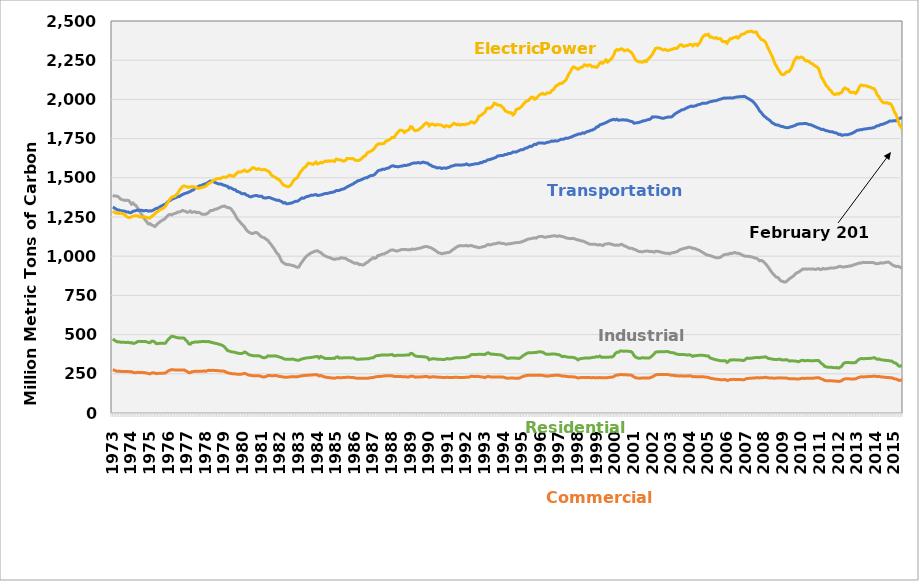
| Category | Commercial Sector | Residential Sector | Industrial Sector | Transportation Sector | Electric Power Sector |
|---|---|---|---|---|---|
| 1973 | 275.438 | 471.942 | 1388.537 | 1312.881 | 1286.353 |
| 1974 January | 273.147 | 465.008 | 1383.552 | 1308.249 | 1280.262 |
| 1974 February | 267.897 | 457.848 | 1383.984 | 1301.215 | 1275.005 |
| 1974 March | 266.469 | 453.42 | 1381.849 | 1295.399 | 1273.75 |
| 1974 April | 267.102 | 454.028 | 1375.39 | 1294.64 | 1272.86 |
| 1974 May | 265.525 | 451.425 | 1364.812 | 1290.01 | 1276.205 |
| 1974 June | 264.767 | 451.348 | 1359.73 | 1289.068 | 1270.364 |
| 1974 July | 264.638 | 451.832 | 1358.257 | 1288.843 | 1269.63 |
| 1974 August | 264.029 | 450.334 | 1355.682 | 1285.774 | 1261.769 |
| 1974 September | 264.437 | 450.129 | 1356.745 | 1282.4 | 1252.474 |
| 1974 October | 265.311 | 451.55 | 1355.984 | 1282.005 | 1247.282 |
| 1974 November | 262.946 | 447.094 | 1346.487 | 1276.76 | 1246.289 |
| 1974 | 264.147 | 449.229 | 1331.92 | 1279.01 | 1250.643 |
| 1975 January | 259.053 | 443.889 | 1339.331 | 1286.574 | 1255.421 |
| 1975 February | 257.606 | 444.877 | 1328.371 | 1288.177 | 1258.224 |
| 1975 March | 257.066 | 448.704 | 1323.031 | 1291.118 | 1258.217 |
| 1975 April | 259.427 | 455.693 | 1307.342 | 1294.078 | 1257.758 |
| 1975 May | 258.969 | 456.906 | 1289.276 | 1293.314 | 1251.508 |
| 1975 June | 258.351 | 456.369 | 1275.248 | 1293.404 | 1252.335 |
| 1975 July | 257.861 | 456.158 | 1261.04 | 1292.045 | 1247.775 |
| 1975 August | 257.286 | 456.347 | 1244.287 | 1288.835 | 1251.193 |
| 1975 September | 256.63 | 455.958 | 1229.707 | 1291.48 | 1250.619 |
| 1975 October | 254.264 | 453.274 | 1217.451 | 1291.472 | 1246.881 |
| 1975 November | 251.112 | 449.152 | 1205.385 | 1286.928 | 1242.758 |
| 1975 | 249.468 | 448.516 | 1207.828 | 1289.447 | 1243.814 |
| 1976 January | 254.906 | 457.341 | 1198.398 | 1288.711 | 1253.431 |
| 1976 February | 256.434 | 458.3 | 1195.954 | 1293.071 | 1259.773 |
| 1976 March | 255.288 | 453.085 | 1189.014 | 1299.261 | 1268.966 |
| 1976 April | 250.744 | 442.574 | 1196.568 | 1304.642 | 1277.929 |
| 1976 May | 251.843 | 442.326 | 1208.164 | 1306.317 | 1284.897 |
| 1976 June | 253.241 | 444.453 | 1215.377 | 1312.325 | 1292.572 |
| 1976 July | 253.649 | 444.836 | 1223.601 | 1318.847 | 1299.356 |
| 1976 August | 254.228 | 444.596 | 1230.134 | 1322.649 | 1302.556 |
| 1976 September | 254.152 | 443.894 | 1234.24 | 1329.107 | 1309.974 |
| 1976 October | 255.251 | 445.522 | 1243.712 | 1331.486 | 1318.639 |
| 1976 November | 263.234 | 459.757 | 1254.378 | 1342.756 | 1336.437 |
| 1976 | 269.318 | 470.952 | 1263.739 | 1351.602 | 1351.186 |
| 1977 January | 273.749 | 481.084 | 1266.524 | 1355.11 | 1366.608 |
| 1977 February | 276.772 | 489.423 | 1262.778 | 1363.095 | 1375.38 |
| 1977 March | 275.544 | 487.574 | 1269.607 | 1366.931 | 1380.036 |
| 1977 April | 274.726 | 485.04 | 1272.575 | 1371.129 | 1381.949 |
| 1977 May | 273.716 | 481.888 | 1275.453 | 1374.932 | 1392.805 |
| 1977 June | 273.55 | 479.632 | 1282.059 | 1379.703 | 1403.152 |
| 1977 July | 274.098 | 478.679 | 1281.819 | 1381.037 | 1420.709 |
| 1977 August | 274.598 | 478.805 | 1285.695 | 1388.669 | 1432.689 |
| 1977 September | 274.752 | 478.242 | 1292.213 | 1393.406 | 1444.917 |
| 1977 October | 274.77 | 477.329 | 1288.221 | 1398.35 | 1448.486 |
| 1977 November | 269.059 | 466.284 | 1285.616 | 1401.854 | 1444.218 |
| 1977 | 264.549 | 456.918 | 1279.253 | 1404.132 | 1442.127 |
| 1978 January | 257.187 | 441.209 | 1282.311 | 1409.092 | 1438.43 |
| 1978 February | 257.437 | 439.174 | 1288.123 | 1412.47 | 1442.626 |
| 1978 March | 263.43 | 448.253 | 1279.67 | 1420.113 | 1443.105 |
| 1978 April | 264.049 | 449.751 | 1282.002 | 1422.431 | 1442.973 |
| 1978 May | 265.604 | 453.099 | 1283.746 | 1434.46 | 1439.545 |
| 1978 June | 265.617 | 453.169 | 1277.821 | 1439.17 | 1438.658 |
| 1978 July | 265.403 | 453.129 | 1279.79 | 1443.256 | 1431.717 |
| 1978 August | 265.938 | 454.423 | 1277.631 | 1449.43 | 1433.98 |
| 1978 September | 266.417 | 455.44 | 1269.993 | 1450.153 | 1436.952 |
| 1978 October | 267.004 | 455.565 | 1266.878 | 1454.96 | 1440.056 |
| 1978 November | 267.626 | 457.013 | 1267.336 | 1460.302 | 1442.871 |
| 1978 | 266.335 | 454.525 | 1267.116 | 1461.427 | 1447.658 |
| 1979 January | 270.022 | 455.808 | 1273.285 | 1467.569 | 1456.078 |
| 1979 February | 272.484 | 456.528 | 1280.157 | 1474.108 | 1464.199 |
| 1979 March | 270.815 | 450.644 | 1291.61 | 1479.407 | 1468.883 |
| 1979 April | 272.569 | 450.56 | 1290.744 | 1477.949 | 1476.218 |
| 1979 May | 271.8 | 446.733 | 1293.645 | 1474.679 | 1483.558 |
| 1979 June | 271.194 | 444.487 | 1300.039 | 1470.058 | 1488.017 |
| 1979 July | 270.686 | 442.769 | 1300.493 | 1465.637 | 1493.681 |
| 1979 August | 269.505 | 440 | 1305.848 | 1461.712 | 1495.486 |
| 1979 September | 268.498 | 436.796 | 1310.218 | 1460.074 | 1493.33 |
| 1979 October | 267.648 | 433.497 | 1315.809 | 1460.265 | 1498.54 |
| 1979 November | 267.892 | 429.814 | 1317.57 | 1454.723 | 1503.732 |
| 1979 | 266.324 | 421.743 | 1320.323 | 1451.995 | 1505.247 |
| 1980 January | 261.117 | 409.968 | 1313.277 | 1448.264 | 1502.008 |
| 1980 February | 255.85 | 398.369 | 1310.914 | 1445.278 | 1507.827 |
| 1980 March | 254.232 | 395.375 | 1309.046 | 1434.705 | 1516.755 |
| 1980 April | 252.231 | 391.707 | 1304.195 | 1436.774 | 1515.627 |
| 1980 May | 250.846 | 389.418 | 1291.967 | 1430.958 | 1510.623 |
| 1980 June | 250.341 | 388.346 | 1278.03 | 1424.941 | 1509.306 |
| 1980 July | 249.341 | 386.177 | 1261.771 | 1423.883 | 1520.232 |
| 1980 August | 247.565 | 382.779 | 1240.816 | 1413.623 | 1529.541 |
| 1980 September | 246.931 | 380.853 | 1230.324 | 1411.082 | 1537.682 |
| 1980 October | 247.092 | 379.778 | 1218.633 | 1406.947 | 1536.481 |
| 1980 November | 247.646 | 379.546 | 1206.796 | 1399.694 | 1538.333 |
| 1980 | 250.12 | 382.493 | 1197.275 | 1397.68 | 1543.709 |
| 1981 January | 253.095 | 389.155 | 1186.117 | 1399.41 | 1549.22 |
| 1981 February | 249.351 | 384.81 | 1169.079 | 1391.008 | 1540.916 |
| 1981 March | 244.531 | 377.161 | 1159.522 | 1387.398 | 1540.148 |
| 1981 April | 241.115 | 371.248 | 1151.529 | 1381.129 | 1546.061 |
| 1981 May | 239.678 | 368.718 | 1147.674 | 1378.307 | 1552.685 |
| 1981 June | 238.244 | 366.349 | 1144.224 | 1382.417 | 1563.416 |
| 1981 July | 237.643 | 365.392 | 1147.177 | 1384.311 | 1563.969 |
| 1981 August | 238.285 | 365.288 | 1151.604 | 1386.815 | 1557.009 |
| 1981 September | 237.63 | 364.171 | 1149.241 | 1386.743 | 1553.345 |
| 1981 October | 237.725 | 364.935 | 1141.887 | 1382.027 | 1558.022 |
| 1981 November | 235.677 | 362.151 | 1131.225 | 1383.01 | 1554.62 |
| 1981 | 232.155 | 356.546 | 1122.786 | 1383.07 | 1551.136 |
| 1982 January | 229.965 | 353.04 | 1119.243 | 1372.983 | 1552.23 |
| 1982 February | 230.525 | 352.919 | 1116.079 | 1371.607 | 1552.55 |
| 1982 March | 233.3 | 355.975 | 1106.634 | 1370.892 | 1547.571 |
| 1982 April | 238.47 | 364.281 | 1101.674 | 1374.882 | 1542.268 |
| 1982 May | 238.663 | 363.974 | 1086.831 | 1374.239 | 1537.037 |
| 1982 June | 238.203 | 363.711 | 1076.183 | 1370.723 | 1520.581 |
| 1982 July | 238.044 | 363.313 | 1061.243 | 1366.341 | 1510.902 |
| 1982 August | 237.796 | 362.822 | 1048.43 | 1363.154 | 1507.262 |
| 1982 September | 239.253 | 364.851 | 1031.702 | 1359.5 | 1501.722 |
| 1982 October | 236.835 | 361.43 | 1017.211 | 1355.982 | 1492.785 |
| 1982 November | 234.672 | 358.449 | 1008.016 | 1357.811 | 1489.66 |
| 1982 | 232.52 | 354.875 | 985.26 | 1351.722 | 1480.79 |
| 1983 January | 231.47 | 352.633 | 965.51 | 1347.666 | 1465.412 |
| 1983 February | 229.205 | 346.258 | 959.009 | 1339.158 | 1454.466 |
| 1983 March | 228.62 | 344.191 | 951.113 | 1342.234 | 1449.722 |
| 1983 April | 228.401 | 342.101 | 947.254 | 1334.331 | 1446.549 |
| 1983 May | 228.918 | 342.956 | 947.54 | 1334.658 | 1443.505 |
| 1983 June | 229.887 | 343.193 | 944.821 | 1337.225 | 1447.079 |
| 1983 July | 231.072 | 343.341 | 943.538 | 1337.673 | 1455.816 |
| 1983 August | 232.155 | 343.904 | 939.494 | 1342.616 | 1475.247 |
| 1983 September | 231.335 | 341.348 | 938.482 | 1346.664 | 1487.73 |
| 1983 October | 231.11 | 338.419 | 932.591 | 1350.24 | 1494.911 |
| 1983 November | 231.534 | 336.21 | 929.033 | 1350.116 | 1500.57 |
| 1983 | 232.769 | 336.025 | 931.137 | 1356.746 | 1520.703 |
| 1984 January | 236.066 | 341.703 | 949.536 | 1364.485 | 1537.076 |
| 1984 February | 237.088 | 344.027 | 963.056 | 1371.671 | 1548.356 |
| 1984 March | 239.016 | 347.594 | 976.866 | 1369.298 | 1561.508 |
| 1984 April | 239.387 | 349.115 | 989.86 | 1375.039 | 1567.983 |
| 1984 May | 240.94 | 351.359 | 1000.998 | 1380.343 | 1577.522 |
| 1984 June | 241.117 | 352.122 | 1008.265 | 1381.731 | 1593.457 |
| 1984 July | 241.596 | 353.157 | 1015.228 | 1385.608 | 1591.697 |
| 1984 August | 242.233 | 354.37 | 1021.601 | 1389.521 | 1589.134 |
| 1984 September | 243.35 | 356.135 | 1025.399 | 1388.115 | 1585.225 |
| 1984 October | 243.762 | 357.54 | 1031.037 | 1391.205 | 1592.512 |
| 1984 November | 244.295 | 359.612 | 1032.392 | 1393.408 | 1600.169 |
| 1984 | 243.246 | 360.11 | 1035.164 | 1387.019 | 1588.294 |
| 1985 January | 236.463 | 351.01 | 1027.815 | 1388.642 | 1591.987 |
| 1985 February | 239.391 | 360.558 | 1023.837 | 1390.377 | 1598.038 |
| 1985 March | 235.77 | 356.956 | 1014.797 | 1392.649 | 1594.99 |
| 1985 April | 231.868 | 352.388 | 1007.012 | 1396.931 | 1600.556 |
| 1985 May | 228.557 | 347.701 | 1000.902 | 1399.559 | 1607.22 |
| 1985 June | 227.235 | 347.068 | 996.989 | 1399.232 | 1603.953 |
| 1985 July | 226.282 | 347.122 | 992.999 | 1402.085 | 1608.504 |
| 1985 August | 224.807 | 347.102 | 990.549 | 1405.396 | 1604.965 |
| 1985 September | 223.327 | 347.003 | 985.712 | 1405.812 | 1608.736 |
| 1985 October | 223.164 | 348.8 | 982.729 | 1409.325 | 1607.199 |
| 1985 November | 221.787 | 348.138 | 979.09 | 1411.008 | 1604.037 |
| 1985 | 224.407 | 355.659 | 982.674 | 1418.344 | 1619.145 |
| 1986 January | 226.812 | 358.28 | 983.324 | 1419.184 | 1617.259 |
| 1986 February | 224.369 | 350.245 | 984.247 | 1419.635 | 1614.461 |
| 1986 March | 225.601 | 351.874 | 989.748 | 1424.337 | 1613.546 |
| 1986 April | 225.605 | 350.484 | 988.389 | 1427.089 | 1609.079 |
| 1986 May | 226.842 | 352.529 | 987.385 | 1429.626 | 1605.871 |
| 1986 June | 227.209 | 352.103 | 986.768 | 1434.932 | 1610.952 |
| 1986 July | 227.305 | 352.098 | 979.775 | 1442.135 | 1623.691 |
| 1986 August | 227.49 | 352.055 | 973.702 | 1446.362 | 1621.745 |
| 1986 September | 227.193 | 351.764 | 970.744 | 1451.566 | 1622.894 |
| 1986 October | 227.015 | 351.364 | 964.127 | 1456.986 | 1621.76 |
| 1986 November | 227.114 | 352.677 | 960.032 | 1460.725 | 1622.516 |
| 1986 | 223.952 | 347.117 | 954.294 | 1469.053 | 1613.249 |
| 1987 January | 221.845 | 343.599 | 955.978 | 1473.401 | 1611.209 |
| 1987 February | 220.826 | 342.453 | 954.565 | 1481.03 | 1609.764 |
| 1987 March | 220.885 | 342.297 | 946.031 | 1482.789 | 1612.685 |
| 1987 April | 221.778 | 344.8 | 946.941 | 1486.873 | 1618.951 |
| 1987 May | 221.343 | 344.053 | 943.626 | 1490.883 | 1627.977 |
| 1987 June | 221.467 | 344.727 | 945.841 | 1496.115 | 1637.871 |
| 1987 July | 222.06 | 345.644 | 955.045 | 1500.296 | 1641.503 |
| 1987 August | 221.621 | 345.401 | 960.587 | 1500.246 | 1658.537 |
| 1987 September | 222.677 | 346.422 | 967.251 | 1507.943 | 1662.847 |
| 1987 October | 224.624 | 349.903 | 976.41 | 1512.636 | 1667.777 |
| 1987 November | 226.012 | 351.763 | 982.426 | 1514.989 | 1672.574 |
| 1987 | 226.832 | 352.778 | 990.275 | 1515.878 | 1680.19 |
| 1988 January | 229.4 | 360.143 | 986.148 | 1522.539 | 1691.889 |
| 1988 February | 231.663 | 365.309 | 990.99 | 1533.461 | 1707.409 |
| 1988 March | 232.577 | 367.157 | 1004.979 | 1544.402 | 1714.642 |
| 1988 April | 232.718 | 366.985 | 1005.196 | 1548.756 | 1718.088 |
| 1988 May | 233.923 | 369.25 | 1010.871 | 1549.821 | 1716.072 |
| 1988 June | 234.891 | 369.313 | 1013.306 | 1555.065 | 1717.634 |
| 1988 July | 235.953 | 369.463 | 1014.341 | 1553.546 | 1719.836 |
| 1988 August | 238.076 | 370.522 | 1020.62 | 1558.015 | 1732.831 |
| 1988 September | 238.045 | 370.488 | 1024.699 | 1561.147 | 1735.963 |
| 1988 October | 237.459 | 369.97 | 1031.049 | 1563.41 | 1741.645 |
| 1988 November | 237.906 | 371.783 | 1037.745 | 1570.704 | 1747.476 |
| 1988 | 237.994 | 373.704 | 1039.294 | 1575.782 | 1757.52 |
| 1989 January | 234.067 | 367.041 | 1039 | 1576.401 | 1755.902 |
| 1989 February | 232.062 | 364.949 | 1035.422 | 1571.705 | 1766.058 |
| 1989 March | 232.745 | 367.439 | 1032.3 | 1572.166 | 1781.227 |
| 1989 April | 232.888 | 368.371 | 1035.234 | 1569.659 | 1793.132 |
| 1989 May | 232.497 | 368.03 | 1037.837 | 1572.632 | 1802.882 |
| 1989 June | 232.563 | 368.886 | 1042.197 | 1574.618 | 1803.668 |
| 1989 July | 231.529 | 368.357 | 1043.624 | 1575.62 | 1801.289 |
| 1989 August | 230.93 | 368.792 | 1042.854 | 1579.92 | 1789.28 |
| 1989 September | 230.711 | 369.551 | 1042.966 | 1577.959 | 1797.151 |
| 1989 October | 229.717 | 369.185 | 1041.119 | 1581.548 | 1802.007 |
| 1989 November | 229.8 | 370.003 | 1041.314 | 1583.052 | 1807.352 |
| 1989 | 234.824 | 380.365 | 1041.426 | 1587.942 | 1825.562 |
| 1990 January | 235.092 | 379.175 | 1045.509 | 1591.172 | 1823.9 |
| 1990 February | 232.158 | 371.647 | 1044.705 | 1594.684 | 1807.279 |
| 1990 March | 228.752 | 363.409 | 1044.005 | 1594.207 | 1800.182 |
| 1990 April | 228.868 | 361.642 | 1047.302 | 1594.894 | 1802.469 |
| 1990 May | 229.033 | 360.503 | 1049.596 | 1597.804 | 1805.166 |
| 1990 June | 229.549 | 359.865 | 1050.636 | 1593.974 | 1813.742 |
| 1990 July | 230.9 | 359.586 | 1053.6 | 1595.762 | 1820.872 |
| 1990 August | 231.491 | 359.063 | 1058.018 | 1600.1 | 1830.63 |
| 1990 September | 232.254 | 357.983 | 1059.939 | 1597.698 | 1841.336 |
| 1990 October | 232.678 | 356.111 | 1061.95 | 1594.605 | 1850.448 |
| 1990 November | 232.168 | 352.758 | 1060.585 | 1593.569 | 1847.906 |
| 1990 | 226.818 | 339.703 | 1056.671 | 1584.446 | 1831.001 |
| 1991 January | 229.638 | 344.298 | 1054.563 | 1580.782 | 1841.275 |
| 1991 February | 230.533 | 345.248 | 1049.042 | 1574.119 | 1842.962 |
| 1991 March | 230.881 | 346.451 | 1042.926 | 1570.255 | 1839.533 |
| 1991 April | 229.805 | 344.649 | 1036.637 | 1568.326 | 1834.278 |
| 1991 May | 229.212 | 343.403 | 1028.857 | 1563.106 | 1840.275 |
| 1991 June | 228.432 | 342.593 | 1021.567 | 1563.528 | 1837.578 |
| 1991 July | 228.246 | 342.671 | 1019.891 | 1564.379 | 1837.519 |
| 1991 August | 227.149 | 341.637 | 1015.621 | 1558.998 | 1835.298 |
| 1991 September | 226.138 | 340.938 | 1017.84 | 1561.864 | 1828.739 |
| 1991 October | 226.207 | 341.031 | 1019.333 | 1563.175 | 1824.026 |
| 1991 November | 227.18 | 345.452 | 1022.305 | 1560.748 | 1832.321 |
| 1991 | 227.773 | 347.278 | 1023.211 | 1564.794 | 1829.556 |
| 1992 January | 225.63 | 343.915 | 1025.105 | 1566.9 | 1825.051 |
| 1992 February | 225.866 | 346.351 | 1031.505 | 1573.981 | 1830.649 |
| 1992 March | 225.777 | 346.93 | 1040.228 | 1574.906 | 1839.915 |
| 1992 April | 227.248 | 350.547 | 1046.169 | 1578.577 | 1847.667 |
| 1992 May | 227.631 | 351.592 | 1053.955 | 1582.214 | 1842.27 |
| 1992 June | 227.544 | 352.352 | 1060.212 | 1580.843 | 1837.877 |
| 1992 July | 226.688 | 352.388 | 1064.994 | 1582.006 | 1841.91 |
| 1992 August | 226.402 | 351.98 | 1067.635 | 1580.685 | 1835.924 |
| 1992 September | 227.084 | 353.272 | 1065.895 | 1581.235 | 1840.04 |
| 1992 October | 226.818 | 354.296 | 1065.88 | 1582.672 | 1840.53 |
| 1992 November | 226.863 | 353.28 | 1065.98 | 1583.506 | 1838.132 |
| 1992 | 228.833 | 357.098 | 1069.17 | 1588.494 | 1843.422 |
| 1993 January | 228.162 | 358.825 | 1064.642 | 1583.674 | 1843.138 |
| 1993 February | 230.1 | 363.281 | 1067.03 | 1580.614 | 1849.074 |
| 1993 March | 233.624 | 371.685 | 1068.128 | 1583.518 | 1857.106 |
| 1993 April | 233.831 | 373.164 | 1065.752 | 1585.33 | 1854.181 |
| 1993 May | 232.802 | 372.66 | 1061.119 | 1587.425 | 1848.738 |
| 1993 June | 232.836 | 373.146 | 1060.499 | 1589.503 | 1856.828 |
| 1993 July | 232.569 | 373.578 | 1056.773 | 1589.957 | 1869.845 |
| 1993 August | 232.395 | 374.918 | 1054.034 | 1591.243 | 1892.943 |
| 1993 September | 231.085 | 374.49 | 1056.492 | 1596.84 | 1895.929 |
| 1993 October | 229.719 | 373.631 | 1058.634 | 1596.585 | 1902.704 |
| 1993 November | 228.516 | 373.976 | 1061.7 | 1603.253 | 1911.036 |
| 1993 | 226.052 | 372.423 | 1063.125 | 1603.957 | 1919.085 |
| 1994 January | 230.696 | 380.346 | 1070.58 | 1609.692 | 1940.389 |
| 1994 February | 233.095 | 384.534 | 1075.452 | 1614.794 | 1945.454 |
| 1994 March | 231.355 | 379.363 | 1071.388 | 1616.146 | 1942.798 |
| 1994 April | 229.501 | 375.137 | 1073.649 | 1619.902 | 1948.148 |
| 1994 May | 229.993 | 375.582 | 1077.334 | 1622.2 | 1959.283 |
| 1994 June | 230.066 | 374.428 | 1079.897 | 1626.997 | 1975.976 |
| 1994 July | 230.071 | 373.204 | 1080.02 | 1629.679 | 1972.012 |
| 1994 August | 230.065 | 372.439 | 1083.689 | 1638.695 | 1964.486 |
| 1994 September | 229.862 | 371.401 | 1085.235 | 1639.525 | 1963.085 |
| 1994 October | 230.204 | 370.906 | 1083.767 | 1642.484 | 1961.709 |
| 1994 November | 229.424 | 367.544 | 1080.412 | 1641.552 | 1953.184 |
| 1994 | 228.598 | 364.235 | 1080.607 | 1644.094 | 1943.845 |
| 1995 January | 224.386 | 355.231 | 1077.821 | 1648.647 | 1926.892 |
| 1995 February | 222.507 | 350.347 | 1075.403 | 1648.756 | 1922.719 |
| 1995 March | 221.486 | 348.083 | 1078.956 | 1654.712 | 1917.747 |
| 1995 April | 222.617 | 350.106 | 1078.892 | 1654.358 | 1914.008 |
| 1995 May | 223.255 | 350.698 | 1081.331 | 1657.695 | 1914.236 |
| 1995 June | 222.771 | 350.872 | 1082.725 | 1664.338 | 1900.732 |
| 1995 July | 221.996 | 350.468 | 1085.102 | 1664.71 | 1908.879 |
| 1995 August | 221.812 | 349.191 | 1085.414 | 1664.03 | 1933.873 |
| 1995 September | 222.297 | 348.825 | 1087.651 | 1669.453 | 1939.88 |
| 1995 October | 222.352 | 347.871 | 1086.833 | 1673.273 | 1941.444 |
| 1995 November | 226.155 | 353.671 | 1090.334 | 1678.79 | 1949.505 |
| 1995 | 231.353 | 360.945 | 1092.335 | 1678.088 | 1960.035 |
| 1996 January | 235.02 | 368.837 | 1097.231 | 1681.789 | 1972.529 |
| 1996 February | 236.982 | 374.044 | 1101.095 | 1689.096 | 1982.575 |
| 1996 March | 239.809 | 380.798 | 1105.713 | 1689.805 | 1990.289 |
| 1996 April | 241.325 | 383.784 | 1109.965 | 1695.625 | 1993.075 |
| 1996 May | 241.308 | 384.475 | 1110.567 | 1701.308 | 2003.56 |
| 1996 June | 241.31 | 384.815 | 1113.073 | 1699.54 | 2013.937 |
| 1996 July | 241.462 | 384.899 | 1115.003 | 1707.699 | 2013.382 |
| 1996 August | 241.194 | 385.44 | 1117.073 | 1714.151 | 2000.747 |
| 1996 September | 240.695 | 386.086 | 1114.802 | 1712.169 | 2006.308 |
| 1996 October | 241.344 | 388.592 | 1122.707 | 1720.501 | 2016.505 |
| 1996 November | 241.565 | 390.717 | 1124.981 | 1721.835 | 2028.171 |
| 1996 | 240.029 | 389.36 | 1125.174 | 1721.988 | 2033.237 |
| 1997 January | 239.972 | 388.342 | 1126.06 | 1722.371 | 2039.14 |
| 1997 February | 237.855 | 382.936 | 1122.43 | 1720.217 | 2033.131 |
| 1997 March | 235.86 | 376.657 | 1120.383 | 1721.409 | 2033.658 |
| 1997 April | 235.07 | 374.569 | 1123.553 | 1725.923 | 2041.404 |
| 1997 May | 236.138 | 375.099 | 1125.186 | 1727.294 | 2040.897 |
| 1997 June | 237.333 | 375.219 | 1125.142 | 1730.122 | 2042.221 |
| 1997 July | 238.711 | 375.812 | 1128.287 | 1735.013 | 2056.773 |
| 1997 August | 239.751 | 376.105 | 1129.594 | 1732.49 | 2061.293 |
| 1997 September | 240.741 | 375.755 | 1130.055 | 1736.493 | 2075.255 |
| 1997 October | 241.114 | 374.501 | 1127.657 | 1734.013 | 2088.442 |
| 1997 November | 240.413 | 372.067 | 1127.489 | 1735.775 | 2090.352 |
| 1997 | 240.199 | 371.064 | 1130.451 | 1740.947 | 2101.384 |
| 1998 January | 237.25 | 363.834 | 1126.504 | 1745.484 | 2100.409 |
| 1998 February | 235.06 | 359.169 | 1124.668 | 1745.414 | 2104.308 |
| 1998 March | 235.418 | 361.701 | 1122.482 | 1747.484 | 2115.08 |
| 1998 April | 234.115 | 359.447 | 1117.902 | 1752.931 | 2120.987 |
| 1998 May | 232.549 | 356.559 | 1114.956 | 1751.528 | 2140.1 |
| 1998 June | 231.583 | 355.829 | 1113.406 | 1754.336 | 2162.647 |
| 1998 July | 231.043 | 355.558 | 1111.866 | 1757.833 | 2175.163 |
| 1998 August | 230.972 | 355.082 | 1113.303 | 1761.962 | 2195.974 |
| 1998 September | 230.126 | 353.35 | 1113.683 | 1766.792 | 2207.398 |
| 1998 October | 229.201 | 351.671 | 1109.861 | 1770.942 | 2203.474 |
| 1998 November | 226.446 | 345.75 | 1105.631 | 1773.644 | 2197.254 |
| 1998 | 222.993 | 338.617 | 1103.427 | 1778.643 | 2191.771 |
| 1999 January | 224.951 | 345.396 | 1101.372 | 1778.671 | 2199.498 |
| 1999 February | 226.008 | 346.796 | 1097.915 | 1781.343 | 2204.144 |
| 1999 March | 227.089 | 348.817 | 1096.563 | 1786.512 | 2208.418 |
| 1999 April | 227.166 | 349.939 | 1093.024 | 1783.953 | 2220.507 |
| 1999 May | 226.724 | 350.211 | 1087.713 | 1790.547 | 2218.735 |
| 1999 June | 226.679 | 350.745 | 1084.115 | 1795.498 | 2213.279 |
| 1999 July | 226.018 | 350.999 | 1078.231 | 1796.443 | 2219.969 |
| 1999 August | 225.495 | 351.523 | 1075.665 | 1802.042 | 2218.752 |
| 1999 September | 225.469 | 353.568 | 1076.823 | 1803.826 | 2208.111 |
| 1999 October | 225.86 | 355.974 | 1076.25 | 1809.083 | 2208.175 |
| 1999 November | 225.076 | 355.691 | 1075.784 | 1813.222 | 2208.629 |
| 1999 | 225.669 | 359.6 | 1073.493 | 1824.603 | 2204.392 |
| 2000 January | 224.768 | 357.683 | 1071.013 | 1826.105 | 2214.951 |
| 2000 February | 226.192 | 362.858 | 1074.352 | 1837.754 | 2231.699 |
| 2000 March | 224.02 | 355.872 | 1071.115 | 1840.527 | 2235.862 |
| 2000 April | 224.097 | 355.137 | 1067.828 | 1843.906 | 2230.649 |
| 2000 May | 224.871 | 355.264 | 1075.56 | 1847.734 | 2242.08 |
| 2000 June | 225.219 | 355.041 | 1077.883 | 1851.892 | 2251.988 |
| 2000 July | 225.513 | 355.031 | 1079.104 | 1857.322 | 2238.902 |
| 2000 August | 227.156 | 356.353 | 1079.962 | 1862.538 | 2246.231 |
| 2000 September | 228.469 | 357.234 | 1078.414 | 1867.108 | 2255.174 |
| 2000 October | 228.895 | 357.845 | 1074.616 | 1869.784 | 2265.273 |
| 2000 November | 232.016 | 364.318 | 1071.933 | 1872.889 | 2282.695 |
| 2000 | 239.163 | 379.906 | 1069.743 | 1868.892 | 2310.169 |
| 2001 January | 242.399 | 386.712 | 1071.585 | 1873.225 | 2317.762 |
| 2001 February | 242.461 | 386.682 | 1069.369 | 1866.71 | 2313.585 |
| 2001 March | 244.667 | 395.011 | 1072.81 | 1868.358 | 2318.395 |
| 2001 April | 245.158 | 395.843 | 1075.859 | 1869.158 | 2323.377 |
| 2001 May | 244.05 | 394.531 | 1071.302 | 1870.631 | 2317.16 |
| 2001 June | 243.563 | 394.315 | 1064.696 | 1868.128 | 2309.838 |
| 2001 July | 243.724 | 394.966 | 1062.165 | 1869.423 | 2314.365 |
| 2001 August | 242.395 | 394.182 | 1056.512 | 1866.649 | 2315.957 |
| 2001 September | 241.669 | 392.918 | 1050.434 | 1862.996 | 2308.817 |
| 2001 October | 241.816 | 392.561 | 1051.182 | 1860.291 | 2302.669 |
| 2001 November | 238.225 | 385.736 | 1049.947 | 1857.797 | 2291.018 |
| 2001 | 230.159 | 366.998 | 1043.364 | 1848.146 | 2272.636 |
| 2002 January | 225.286 | 356.554 | 1041.674 | 1849.964 | 2253.484 |
| 2002 February | 223.236 | 352.163 | 1035.785 | 1850.875 | 2244.856 |
| 2002 March | 222.234 | 349.817 | 1030.614 | 1852.686 | 2240.147 |
| 2002 April | 221.832 | 348.958 | 1029.57 | 1856.084 | 2240.693 |
| 2002 May | 223.243 | 351.554 | 1028.049 | 1858.527 | 2236.956 |
| 2002 June | 223.395 | 351.837 | 1029.346 | 1863.575 | 2239.202 |
| 2002 July | 223.273 | 351.197 | 1032.247 | 1863.577 | 2246.373 |
| 2002 August | 222.984 | 350.572 | 1032.368 | 1867.38 | 2241.312 |
| 2002 September | 222.777 | 350.297 | 1032.485 | 1870.828 | 2254.73 |
| 2002 October | 223.422 | 351.186 | 1029.208 | 1871.71 | 2264.342 |
| 2002 November | 226.975 | 357.768 | 1030.813 | 1878.337 | 2275.795 |
| 2002 | 230.985 | 367.27 | 1029.29 | 1888.829 | 2288.035 |
| 2003 January | 237.191 | 377.1 | 1025.742 | 1887.709 | 2308.759 |
| 2003 February | 242.961 | 387.935 | 1031.588 | 1888.794 | 2325.311 |
| 2003 March | 244.661 | 389.535 | 1030.987 | 1887.65 | 2328.545 |
| 2003 April | 245.272 | 390.681 | 1030.038 | 1885.753 | 2326.454 |
| 2003 May | 245.034 | 390.374 | 1026.675 | 1883.209 | 2324.885 |
| 2003 June | 244.962 | 390.34 | 1024.111 | 1880.433 | 2319.333 |
| 2003 July | 245.219 | 390.678 | 1022.027 | 1879.635 | 2314.843 |
| 2003 August | 245.418 | 390.945 | 1019.47 | 1882.492 | 2319.364 |
| 2003 September | 246.05 | 392.334 | 1017.912 | 1884.517 | 2313.748 |
| 2003 October | 245.242 | 391.399 | 1018.389 | 1888.085 | 2311.631 |
| 2003 November | 242.885 | 387.061 | 1014.707 | 1887.726 | 2314.459 |
| 2003 | 241.334 | 385.169 | 1020.252 | 1887.552 | 2319.17 |
| 2004 January | 240.252 | 384.699 | 1022.345 | 1893.019 | 2319.885 |
| 2004 February | 239.866 | 382.832 | 1023.879 | 1904.159 | 2325.865 |
| 2004 March | 237.545 | 377.342 | 1027.271 | 1910.577 | 2324.787 |
| 2004 April | 237.114 | 375.437 | 1029.036 | 1916.779 | 2326.813 |
| 2004 May | 236.604 | 373.334 | 1037.277 | 1921.932 | 2340.073 |
| 2004 June | 236.831 | 372.931 | 1043.195 | 1928.092 | 2348.026 |
| 2004 July | 236.572 | 372.738 | 1045.2 | 1934.03 | 2347.716 |
| 2004 August | 236.506 | 373.07 | 1048.723 | 1934.788 | 2337.085 |
| 2004 September | 235.683 | 371.641 | 1051.174 | 1939.948 | 2341.587 |
| 2004 October | 235.321 | 370.422 | 1052.668 | 1944.98 | 2342.877 |
| 2004 November | 235.757 | 370.508 | 1057.137 | 1950.065 | 2345.146 |
| 2004 | 237.834 | 371.271 | 1056.926 | 1953.774 | 2350.377 |
| 2005 January | 235.102 | 366.774 | 1054.784 | 1957.83 | 2349.504 |
| 2005 February | 231 | 360.687 | 1049.73 | 1954.842 | 2341.589 |
| 2005 March | 232.305 | 365.832 | 1049.742 | 1957.68 | 2351.607 |
| 2005 April | 231.171 | 365.14 | 1045.828 | 1959.711 | 2352.43 |
| 2005 May | 231.187 | 367.169 | 1041.111 | 1965.184 | 2344.095 |
| 2005 June | 231.249 | 367.885 | 1038.313 | 1967.073 | 2356.003 |
| 2005 July | 231.073 | 367.994 | 1032.027 | 1969.918 | 2370.567 |
| 2005 August | 231.048 | 367.966 | 1026.489 | 1974.769 | 2393.208 |
| 2005 September | 230.536 | 367.268 | 1020.345 | 1975.497 | 2404.91 |
| 2005 October | 229.457 | 365.778 | 1013.456 | 1974.806 | 2411.798 |
| 2005 November | 227.951 | 363.811 | 1008.405 | 1976.506 | 2411.064 |
| 2005 | 227.229 | 364.135 | 1005.8 | 1980.622 | 2415.527 |
| 2006 January | 221.936 | 351.767 | 1004.479 | 1985.354 | 2397.986 |
| 2006 February | 220.417 | 348.266 | 1000.621 | 1986.074 | 2397.744 |
| 2006 March | 218.691 | 344.682 | 997.033 | 1989.219 | 2392.594 |
| 2006 April | 217.126 | 342.59 | 993.612 | 1991.517 | 2390.204 |
| 2006 May | 215.909 | 339.324 | 990.145 | 1992.067 | 2394.265 |
| 2006 June | 214.824 | 337.069 | 990.764 | 1995.505 | 2387.063 |
| 2006 July | 213.59 | 335.15 | 990.265 | 1999.247 | 2387.735 |
| 2006 August | 212.415 | 332.921 | 994.562 | 2002.142 | 2386.249 |
| 2006 September | 212.219 | 332.391 | 1002.001 | 2005.032 | 2369.713 |
| 2006 October | 212.945 | 333.189 | 1008.881 | 2008.722 | 2369.312 |
| 2006 November | 213.063 | 333.337 | 1011.243 | 2007.725 | 2369.593 |
| 2006 | 207.637 | 322.919 | 1012.095 | 2009.014 | 2358.322 |
| 2007 January | 209.112 | 327.704 | 1013.063 | 2008.342 | 2373.396 |
| 2007 February | 213.518 | 338.143 | 1018.464 | 2010.162 | 2386.04 |
| 2007 March | 213.46 | 337.502 | 1017.301 | 2008.469 | 2386.033 |
| 2007 April | 214.808 | 339.534 | 1020.436 | 2009.479 | 2393.681 |
| 2007 May | 214.333 | 338.809 | 1023.603 | 2012.622 | 2395.138 |
| 2007 June | 213.924 | 338.152 | 1019.618 | 2014.725 | 2399.366 |
| 2007 July | 213.579 | 337.754 | 1019.265 | 2015.749 | 2391.117 |
| 2007 August | 213.468 | 337.89 | 1016.29 | 2016.765 | 2398.505 |
| 2007 September | 213.044 | 337.487 | 1012.273 | 2017.972 | 2412.683 |
| 2007 October | 211.551 | 334.335 | 1006.363 | 2017.244 | 2416.474 |
| 2007 November | 212.379 | 335.45 | 1002.706 | 2019.714 | 2417.907 |
| 2007 | 216.742 | 343.775 | 999.375 | 2015.777 | 2424.914 |
| 2008 January | 220.663 | 350.489 | 1000.252 | 2009.357 | 2431.704 |
| 2008 February | 220.526 | 347.59 | 998.638 | 2004.083 | 2431.896 |
| 2008 March | 221.925 | 349.974 | 996.986 | 1997.865 | 2433.76 |
| 2008 April | 222.214 | 349.88 | 995.55 | 1991.884 | 2433.926 |
| 2008 May | 223.274 | 351.617 | 991.44 | 1983.925 | 2429.465 |
| 2008 June | 223.707 | 352.818 | 988.578 | 1972.254 | 2428.618 |
| 2008 July | 224.345 | 353.647 | 987.32 | 1959.681 | 2429.741 |
| 2008 August | 224.168 | 353.526 | 980.649 | 1945.005 | 2407.474 |
| 2008 September | 223.923 | 352.88 | 970.459 | 1927.406 | 2396.081 |
| 2008 October | 225.12 | 354.912 | 973.283 | 1917.862 | 2383 |
| 2008 November | 225.382 | 355.439 | 969.278 | 1904.116 | 2379.403 |
| 2008 | 225.968 | 357.136 | 959.971 | 1893.042 | 2372.831 |
| 2009 January | 227.803 | 358.166 | 950.428 | 1886.604 | 2362.731 |
| 2009 February | 225.062 | 351.659 | 938.01 | 1877.061 | 2338.38 |
| 2009 March | 223.826 | 347.084 | 924.935 | 1870.536 | 2318.111 |
| 2009 April | 223.629 | 346.448 | 909.665 | 1863.39 | 2297.167 |
| 2009 May | 222.782 | 344.033 | 895.457 | 1851.293 | 2277.762 |
| 2009 June | 222.313 | 342.463 | 885.325 | 1847.099 | 2253.894 |
| 2009 July | 222.246 | 341.538 | 873.824 | 1840.313 | 2225.365 |
| 2009 August | 222.662 | 341.315 | 865.127 | 1836.581 | 2210.82 |
| 2009 September | 223.55 | 342.011 | 863.59 | 1837.003 | 2190.779 |
| 2009 October | 224.393 | 343.636 | 849.715 | 1831.244 | 2177.939 |
| 2009 November | 222.811 | 339.836 | 841.096 | 1827.938 | 2160.615 |
| 2009 | 223.123 | 338.252 | 839.409 | 1826.985 | 2157.826 |
| 2010 January | 222.295 | 337.679 | 834.505 | 1822.8 | 2160.157 |
| 2010 February | 223.636 | 340.497 | 836.227 | 1820.253 | 2172.045 |
| 2010 March | 221.514 | 338.093 | 844.981 | 1819.577 | 2177.449 |
| 2010 April | 218.653 | 332.401 | 853.866 | 1820.849 | 2178.164 |
| 2010 May | 218.508 | 332.242 | 860.996 | 1825.22 | 2190.717 |
| 2010 June | 218.919 | 332.679 | 867.895 | 1826.918 | 2210.591 |
| 2010 July | 218.375 | 332.218 | 874.789 | 1831.248 | 2237.958 |
| 2010 August | 217.792 | 331.263 | 885.784 | 1833.612 | 2258.479 |
| 2010 September | 216.891 | 329.931 | 894.285 | 1840.797 | 2269.872 |
| 2010 October | 216.163 | 326.903 | 897.559 | 1842.456 | 2264.509 |
| 2010 November | 218.264 | 330.611 | 904.363 | 1844.515 | 2266.311 |
| 2010 | 220.664 | 335.507 | 911.183 | 1844.299 | 2270.255 |
| 2011 January | 221.284 | 335.973 | 918.464 | 1845.235 | 2265.995 |
| 2011 February | 220.042 | 333.212 | 917.369 | 1846.944 | 2252.315 |
| 2011 March | 221.365 | 333.859 | 918.456 | 1846.501 | 2245.116 |
| 2011 April | 222.207 | 335.071 | 917.368 | 1842.567 | 2246.257 |
| 2011 May | 221.613 | 334.181 | 918.253 | 1839.36 | 2240.15 |
| 2011 June | 221.24 | 333.029 | 918.056 | 1838.659 | 2230.519 |
| 2011 July | 221.471 | 332.497 | 917.644 | 1833.557 | 2228.177 |
| 2011 August | 222.572 | 333.184 | 917.873 | 1829.975 | 2219.565 |
| 2011 September | 223.875 | 334.203 | 915.037 | 1825.082 | 2211.646 |
| 2011 October | 225.292 | 335.572 | 918.279 | 1820.468 | 2207.914 |
| 2011 November | 225.603 | 334.909 | 921.129 | 1817.082 | 2197.844 |
| 2011 | 221.397 | 325.192 | 915.364 | 1813.072 | 2169.669 |
| 2012 January | 216.667 | 315.278 | 915.86 | 1807.621 | 2137.906 |
| 2012 February | 213.387 | 308.548 | 922.572 | 1809.647 | 2125.671 |
| 2012 March | 207.583 | 297.543 | 918.809 | 1803.805 | 2106.114 |
| 2012 April | 206.213 | 294.09 | 919.359 | 1800.309 | 2086.756 |
| 2012 May | 205.833 | 292.475 | 920.914 | 1798.862 | 2078.654 |
| 2012 June | 205.547 | 291.834 | 923.217 | 1795.082 | 2064.051 |
| 2012 July | 205.22 | 291.354 | 925.46 | 1793.562 | 2055.661 |
| 2012 August | 204.858 | 290.746 | 924.89 | 1793.722 | 2040.885 |
| 2012 September | 204.06 | 289.522 | 923.76 | 1788.658 | 2032.42 |
| 2012 October | 203.203 | 288.785 | 926.95 | 1786.959 | 2030.679 |
| 2012 November | 203.324 | 289.938 | 928.42 | 1783.896 | 2037.006 |
| 2012 | 200.968 | 286.283 | 934.194 | 1776.202 | 2034.325 |
| 2013 January | 203.206 | 291.888 | 935.744 | 1777.87 | 2041.132 |
| 2013 February | 206.419 | 298.348 | 932.102 | 1770.859 | 2044.422 |
| 2013 March | 214.481 | 314.232 | 931.658 | 1773.221 | 2064.655 |
| 2013 April | 217.436 | 320.421 | 931.801 | 1774.101 | 2073.32 |
| 2013 May | 218.237 | 321.96 | 935.024 | 1775.013 | 2066.337 |
| 2013 June | 217.739 | 321.489 | 934.842 | 1774.605 | 2064.844 |
| 2013 July | 217.687 | 321.336 | 938.141 | 1779.054 | 2049.767 |
| 2013 August | 217.054 | 320.762 | 937.271 | 1780.734 | 2043.019 |
| 2013 September | 216.972 | 320.955 | 943.117 | 1785.54 | 2046.375 |
| 2013 October | 216.309 | 320.024 | 944.908 | 1790.584 | 2044.392 |
| 2013 November | 218.205 | 322.309 | 948.74 | 1797.146 | 2038.225 |
| 2013 | 222.77 | 332.784 | 952.262 | 1802.805 | 2049.838 |
| 2014 January | 226.845 | 340.894 | 955.22 | 1803.793 | 2071.707 |
| 2014 February | 229.729 | 346.083 | 957.083 | 1807.276 | 2089.1 |
| 2014 March | 230.917 | 347.794 | 957.432 | 1806.717 | 2091.948 |
| 2014 April | 230.008 | 345.854 | 961.738 | 1810.306 | 2086.907 |
| 2014 May | 230.749 | 346.895 | 959.463 | 1810.836 | 2088.244 |
| 2014 June | 231.657 | 347.703 | 958.963 | 1812.715 | 2086.888 |
| 2014 July | 232.117 | 348.19 | 959.605 | 1814.413 | 2080.662 |
| 2014 August | 232.204 | 348.305 | 960.254 | 1815.696 | 2079.783 |
| 2014 September | 233.056 | 349.445 | 959.824 | 1815.9 | 2075.078 |
| 2014 October | 233.827 | 350.38 | 959.823 | 1819.374 | 2069.57 |
| 2014 November | 235.562 | 353.175 | 956.507 | 1820.225 | 2068.019 |
| 2014 | 233.62 | 347.065 | 953.033 | 1827.564 | 2049.829 |
| 2015 January | 231.859 | 342.044 | 952.095 | 1832.193 | 2026.357 |
| 2015 February | 233.183 | 344.73 | 953.66 | 1832.849 | 2016.787 |
| 2015 March | 230.726 | 340.413 | 957.784 | 1839.773 | 1997.76 |
| 2015 April | 229.854 | 338.726 | 955.901 | 1840.295 | 1986.378 |
| 2015 May | 228.618 | 337.102 | 956.746 | 1843.752 | 1978.347 |
| 2015 June | 227.482 | 335.939 | 959.984 | 1847.824 | 1977.591 |
| 2015 July | 226.86 | 335.199 | 961.319 | 1852.246 | 1980.214 |
| 2015 August | 226.543 | 334.581 | 962.439 | 1856.245 | 1974.305 |
| 2015 September | 225.008 | 332.165 | 957.673 | 1862.136 | 1973.45 |
| 2015 October | 225.207 | 332.452 | 949.869 | 1862.126 | 1965.285 |
| 2015 November | 221.371 | 325.511 | 942.35 | 1863.013 | 1944.394 |
| 2015 | 217.801 | 319.46 | 938.161 | 1864.232 | 1918.492 |
| 2016 January | 217.042 | 317.65 | 934.209 | 1863.541 | 1904.619 |
| 2016 February | 212.444 | 307.564 | 936.053 | 1872.309 | 1873.947 |
| 2016 March | 208.095 | 298.416 | 932.866 | 1876.503 | 1842.124 |
| 2016 April | 209.134 | 300.225 | 928.524 | 1881.292 | 1828.235 |
| 2016 May | 210.565 | 302.234 | 922.395 | 1884.593 | 1810.044 |